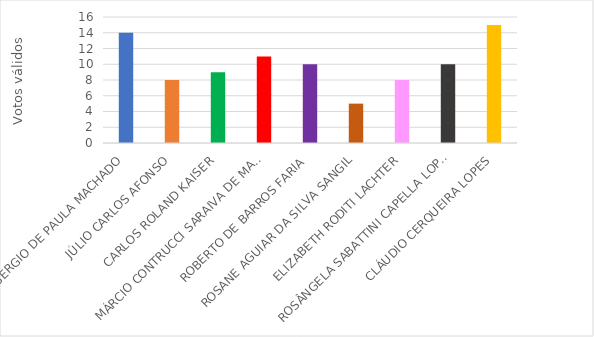
| Category | Series 0 |
|---|---|
| SÉRGIO DE PAULA MACHADO | 14 |
| JÚLIO CARLOS AFONSO | 8 |
| CARLOS ROLAND KAISER | 9 |
| MÁRCIO CONTRUCCI SARAIVA DE MATTOS | 11 |
| ROBERTO DE BARROS FARIA | 10 |
| ROSANE AGUIAR DA SILVA SANGIL | 5 |
| ELIZABETH RODITI LACHTER | 8 |
| ROSÂNGELA SABATTINI CAPELLA LOPES | 10 |
| CLÁUDIO CERQUEIRA LOPES | 15 |